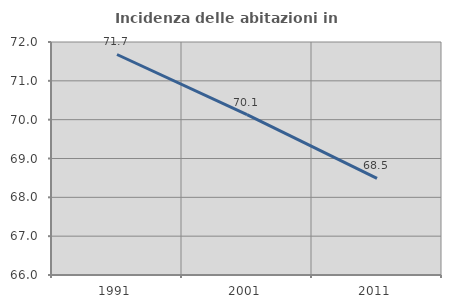
| Category | Incidenza delle abitazioni in proprietà  |
|---|---|
| 1991.0 | 71.678 |
| 2001.0 | 70.132 |
| 2011.0 | 68.489 |